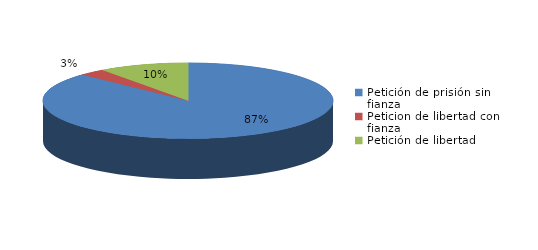
| Category | Series 0 |
|---|---|
| Petición de prisión sin fianza | 645 |
| Peticion de libertad con fianza | 22 |
| Petición de libertad | 74 |